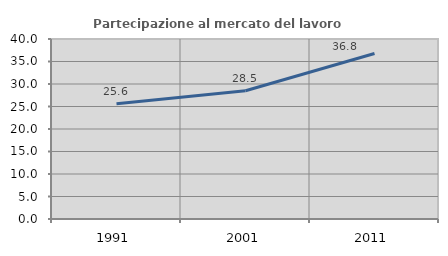
| Category | Partecipazione al mercato del lavoro  femminile |
|---|---|
| 1991.0 | 25.592 |
| 2001.0 | 28.505 |
| 2011.0 | 36.788 |